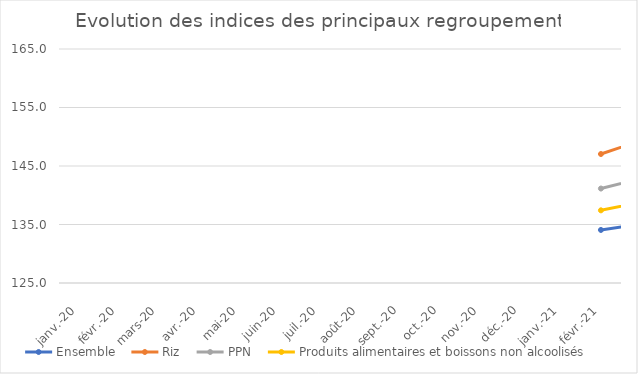
| Category |  Ensemble  |  Riz  |  PPN  |  Produits alimentaires et boissons non alcoolisés  |
|---|---|---|---|---|
| 2021-02-01 | 134.068 | 147.047 | 141.147 | 137.422 |
| 2021-03-01 | 135.051 | 149.367 | 142.872 | 138.8 |
| 2021-04-01 | 136.088 | 149.178 | 143.938 | 140.217 |
| 2021-05-01 | 136.75 | 149.619 | 144.606 | 141.028 |
| 2021-06-01 | 137.421 | 149.519 | 145.469 | 142.002 |
| 2021-07-01 | 137.905 | 149.532 | 146.302 | 142.639 |
| 2021-08-01 | 138.51 | 149.461 | 146.899 | 143.242 |
| 2021-09-01 | 139.014 | 149.302 | 147.252 | 143.631 |
| 2021-10-01 | 139.227 | 149.196 | 147.416 | 143.832 |
| 2021-11-01 | 139.66 | 149.736 | 148.006 | 144.381 |
| 2021-12-01 | 140.647 | 150.942 | 149.401 | 145.589 |
| 2022-01-01 | 141.575 | 152.225 | 150.572 | 146.611 |
| 2022-02-01 | 142.565 | 153.658 | 151.785 | 147.854 |